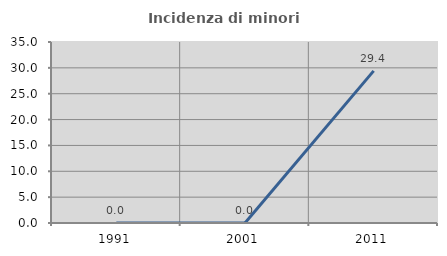
| Category | Incidenza di minori stranieri |
|---|---|
| 1991.0 | 0 |
| 2001.0 | 0 |
| 2011.0 | 29.412 |